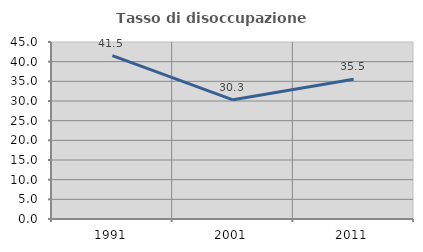
| Category | Tasso di disoccupazione giovanile  |
|---|---|
| 1991.0 | 41.532 |
| 2001.0 | 30.303 |
| 2011.0 | 35.507 |